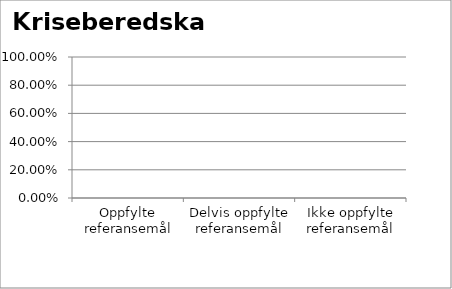
| Category | Kriseberedskap |
|---|---|
| Oppfylte referansemål | 0 |
| Delvis oppfylte referansemål | 0 |
| Ikke oppfylte referansemål | 0 |